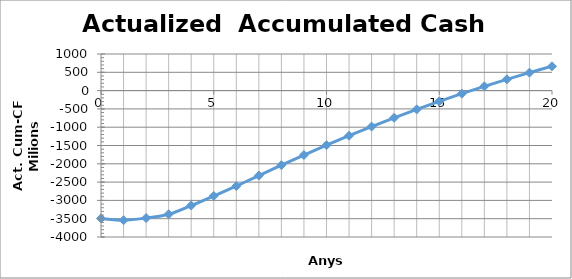
| Category | Series 0 |
|---|---|
| 0.0 | -3493330000 |
| 1.0 | -3541669119.497 |
| 2.0 | -3482919944.199 |
| 3.0 | -3379872712.007 |
| 4.0 | -3139694852.758 |
| 5.0 | -2878203405.173 |
| 6.0 | -2609543708.528 |
| 7.0 | -2320960652.4 |
| 8.0 | -2037094392.411 |
| 9.0 | -1760216334.336 |
| 10.0 | -1491711484.077 |
| 11.0 | -1232413712.447 |
| 12.0 | -982795938.963 |
| 13.0 | -743086088.164 |
| 14.0 | -513341726.253 |
| 15.0 | -293500151.557 |
| 16.0 | -83413130.923 |
| 17.0 | 117128378.661 |
| 18.0 | 308376270.025 |
| 19.0 | 490612024.308 |
| 20.0 | 664136794.542 |